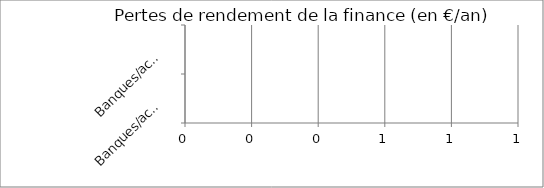
| Category | Series 0 |
|---|---|
| Banques/actifs classiques | 0 |
| Banques/actifs "responsables" | 0 |